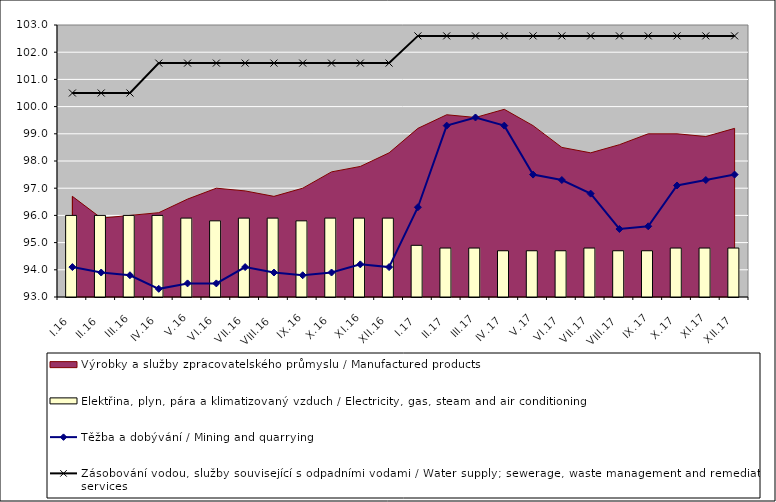
| Category | Elektřina, plyn, pára a klimatizovaný vzduch / Electricity, gas, steam and air conditioning |
|---|---|
| I.16 | 96 |
| II.16 | 96 |
| III.16 | 96 |
| IV.16 | 96 |
| V.16 | 95.9 |
| VI.16 | 95.8 |
| VII.16 | 95.9 |
| VIII.16 | 95.9 |
| IX.16 | 95.8 |
| X.16 | 95.9 |
| XI.16 | 95.9 |
| XII.16 | 95.9 |
| I.17 | 94.9 |
| II.17 | 94.8 |
| III.17 | 94.8 |
| IV.17 | 94.7 |
| V.17 | 94.7 |
| VI.17 | 94.7 |
| VII.17 | 94.8 |
| VIII.17 | 94.7 |
| IX.17 | 94.7 |
| X.17 | 94.8 |
| XI.17 | 94.8 |
| XII.17 | 94.8 |